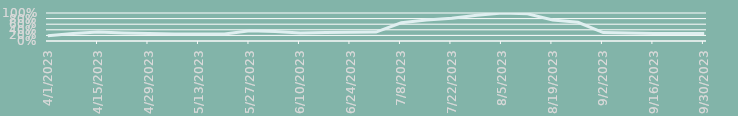
| Category | Intensité prix |
|---|---|
| 4/1/23 | 0.19 |
| 4/8/23 | 0.27 |
| 4/15/23 | 0.32 |
| 4/22/23 | 0.29 |
| 4/29/23 | 0.27 |
| 5/6/23 | 0.25 |
| 5/13/23 | 0.25 |
| 5/20/23 | 0.25 |
| 5/27/23 | 0.37 |
| 6/3/23 | 0.34 |
| 6/10/23 | 0.29 |
| 6/17/23 | 0.3 |
| 6/24/23 | 0.31 |
| 7/1/23 | 0.32 |
| 7/8/23 | 0.65 |
| 7/15/23 | 0.75 |
| 7/22/23 | 0.81 |
| 7/29/23 | 0.92 |
| 8/5/23 | 1 |
| 8/12/23 | 0.97 |
| 8/19/23 | 0.75 |
| 8/26/23 | 0.67 |
| 9/2/23 | 0.3 |
| 9/9/23 | 0.29 |
| 9/16/23 | 0.27 |
| 9/23/23 | 0.27 |
| 9/30/23 | 0.27 |